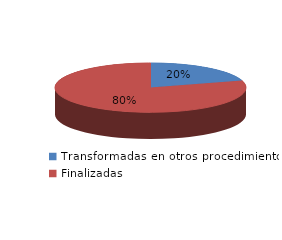
| Category | Series 0 |
|---|---|
| Transformadas en otros procedimientos | 1008 |
| Finalizadas | 3955 |